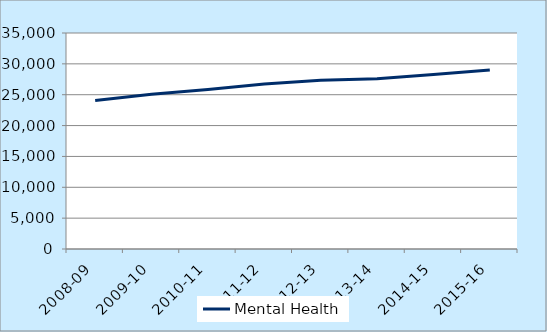
| Category | Mental Health |
|---|---|
| 2008-09 | 24067 |
| 2009-10 | 25069 |
| 2010-11 | 25857 |
| 2011-12 | 26725 |
| 2012-13 | 27349 |
| 2013-14 | 27577 |
| 2014-15 | 28276 |
| 2015-16 | 28997 |